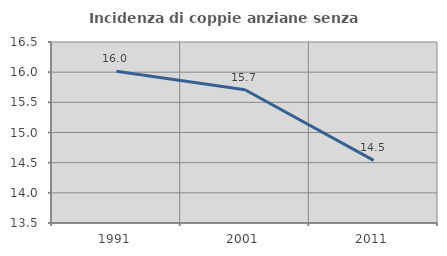
| Category | Incidenza di coppie anziane senza figli  |
|---|---|
| 1991.0 | 16.016 |
| 2001.0 | 15.709 |
| 2011.0 | 14.539 |